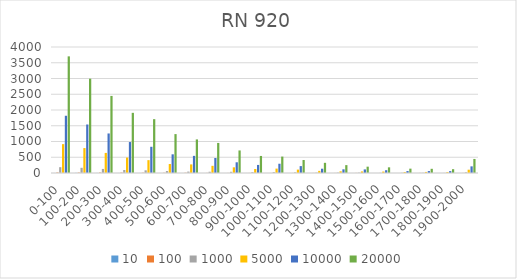
| Category | 10 | 100 | 1000 | 5000 | 10000 | 20000 |
|---|---|---|---|---|---|---|
| 0-100 | 1 | 15 | 185 | 916 | 1817 | 3703 |
| 100-200 | 4 | 13 | 165 | 791 | 1540 | 2994 |
| 200-300 | 2 | 14 | 129 | 638 | 1255 | 2447 |
| 300-400 | 1 | 13 | 95 | 491 | 983 | 1910 |
| 400-500 | 1 | 8 | 85 | 408 | 832 | 1709 |
| 500-600 | 0 | 7 | 62 | 285 | 593 | 1235 |
| 600-700 | 0 | 8 | 45 | 273 | 544 | 1066 |
| 700-800 | 0 | 3 | 40 | 228 | 477 | 954 |
| 800-900 | 0 | 2 | 38 | 180 | 340 | 716 |
| 900-1000 | 1 | 2 | 26 | 127 | 256 | 541 |
| 1000-1100 | 0 | 2 | 30 | 140 | 294 | 521 |
| 1100-1200 | 0 | 1 | 21 | 108 | 219 | 412 |
| 1200-1300 | 0 | 2 | 12 | 68 | 136 | 323 |
| 1300-1400 | 0 | 2 | 12 | 54 | 117 | 250 |
| 1400-1500 | 0 | 3 | 11 | 50 | 114 | 201 |
| 1500-1600 | 0 | 0 | 5 | 46 | 89 | 180 |
| 1600-1700 | 0 | 0 | 7 | 31 | 62 | 138 |
| 1700-1800 | 0 | 3 | 6 | 34 | 61 | 133 |
| 1800-1900 | 0 | 0 | 3 | 27 | 60 | 121 |
| 1900-2000 | 0 | 2 | 23 | 105 | 211 | 446 |